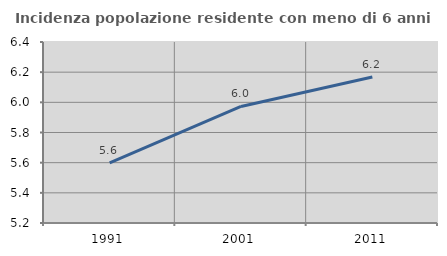
| Category | Incidenza popolazione residente con meno di 6 anni |
|---|---|
| 1991.0 | 5.599 |
| 2001.0 | 5.973 |
| 2011.0 | 6.168 |